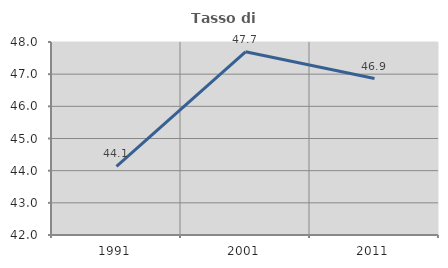
| Category | Tasso di occupazione   |
|---|---|
| 1991.0 | 44.131 |
| 2001.0 | 47.696 |
| 2011.0 | 46.863 |